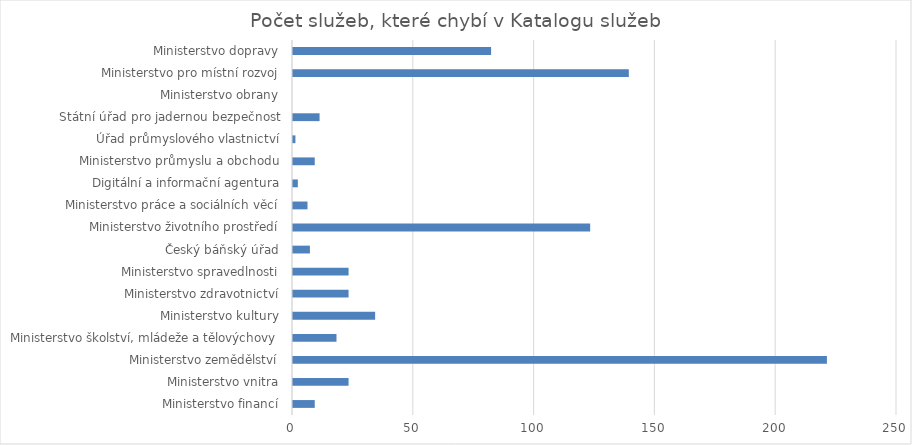
| Category | Počet služeb, které chybí v Katalogu služeb |
|---|---|
| Ministerstvo financí | 9 |
| Ministerstvo vnitra | 23 |
| Ministerstvo zemědělství | 221 |
| Ministerstvo školství, mládeže a tělovýchovy | 18 |
| Ministerstvo kultury | 34 |
| Ministerstvo zdravotnictví | 23 |
| Ministerstvo spravedlnosti | 23 |
| Český báňský úřad | 7 |
| Ministerstvo životního prostředí | 123 |
| Ministerstvo práce a sociálních věcí | 6 |
| Digitální a informační agentura | 2 |
| Ministerstvo průmyslu a obchodu | 9 |
| Úřad průmyslového vlastnictví | 1 |
| Státní úřad pro jadernou bezpečnost | 11 |
| Ministerstvo obrany | 0 |
| Ministerstvo pro místní rozvoj | 139 |
| Ministerstvo dopravy | 82 |